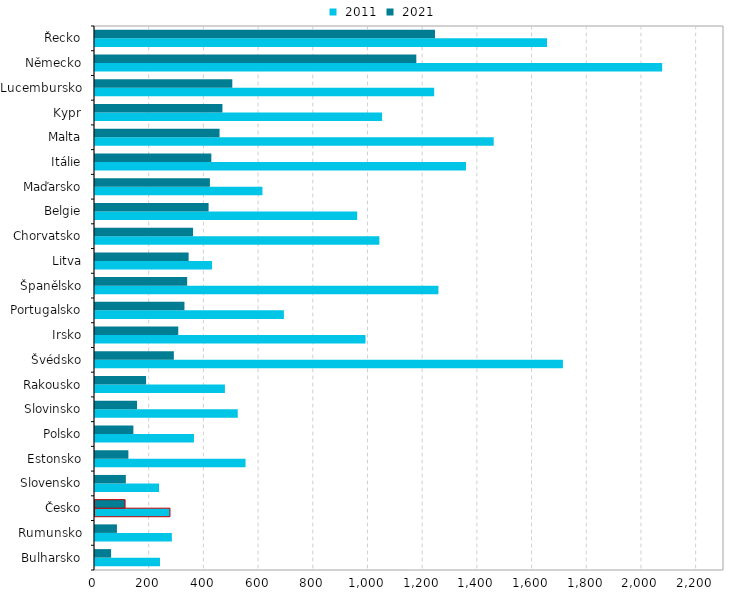
| Category |  2011 |  2021 |
|---|---|---|
| Bulharsko | 237.641 | 58.868 |
| Rumunsko | 281.054 | 80.192 |
| Česko | 274.095 | 110.022 |
| Slovensko | 234.28 | 112.709 |
| Estonsko | 550.462 | 122.053 |
| Polsko | 361.943 | 140.291 |
| Slovinsko | 522.024 | 153.795 |
| Rakousko | 475.112 | 186.872 |
| Švédsko | 1710.992 | 288.337 |
| Irsko | 989.124 | 304.452 |
| Portugalsko | 690.687 | 327.129 |
| Španělsko | 1255.798 | 337.034 |
| Litva | 427.906 | 342.361 |
| Chorvatsko | 1039.86 | 358.506 |
| Belgie | 958.803 | 415.398 |
| Maďarsko | 612.263 | 420.123 |
| Itálie | 1356.641 | 425.392 |
| Malta | 1457.883 | 455.446 |
| Kypr | 1049.673 | 466.021 |
| Lucembursko | 1240.294 | 502.095 |
| Německo | 2073.896 | 1174.939 |
| Řecko | 1652.895 | 1243.163 |